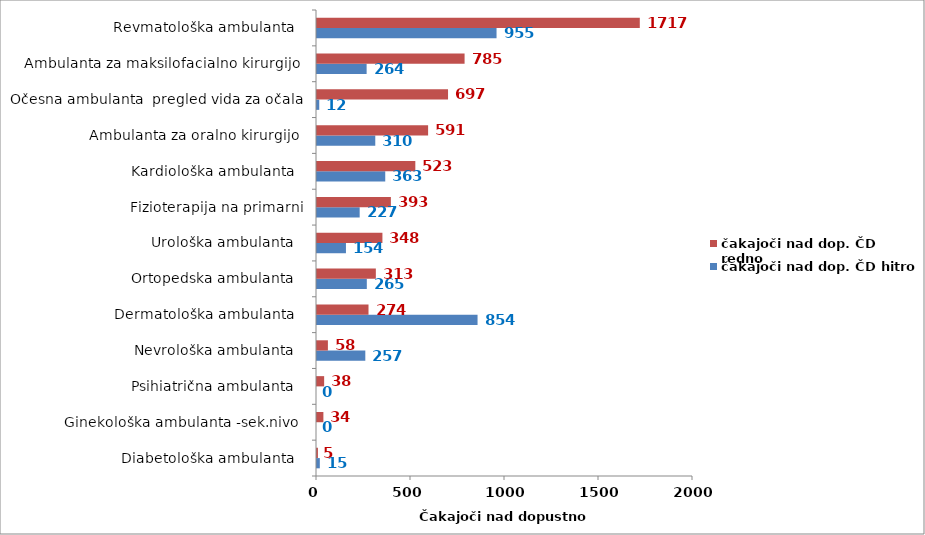
| Category | čakajoči nad dop. ČD hitro | čakajoči nad dop. ČD redno |
|---|---|---|
| Diabetološka ambulanta   | 15 | 5 |
| Ginekološka ambulanta -sek.nivo  | 0 | 34 |
| Psihiatrična ambulanta   | 0 | 38 |
| Nevrološka ambulanta   | 257 | 58 |
| Dermatološka ambulanta   | 854 | 274 |
| Ortopedska ambulanta   | 265 | 313 |
| Urološka ambulanta   | 154 | 348 |
| Fizioterapija na primarni | 227 | 393 |
| Kardiološka ambulanta   | 363 | 523 |
| Ambulanta za oralno kirurgijo  | 310 | 591 |
| Očesna ambulanta  pregled vida za očala | 12 | 697 |
| Ambulanta za maksilofacialno kirurgijo  | 264 | 785 |
| Revmatološka ambulanta   | 955 | 1717 |